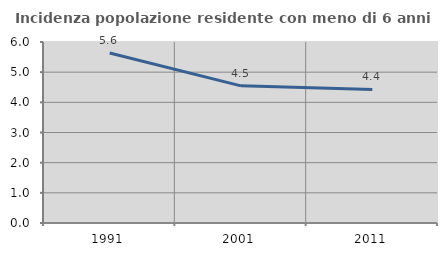
| Category | Incidenza popolazione residente con meno di 6 anni |
|---|---|
| 1991.0 | 5.636 |
| 2001.0 | 4.547 |
| 2011.0 | 4.427 |